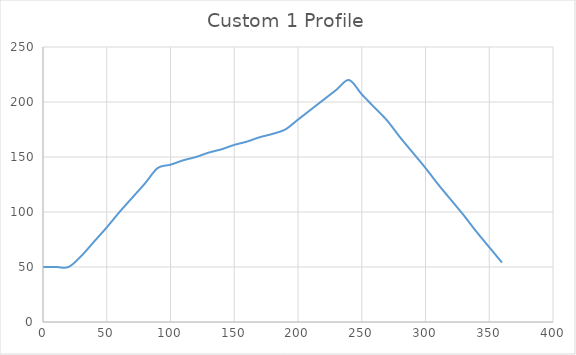
| Category | Custom 1 Profile |
|---|---|
| 0.0 | 50 |
| 10.0 | 50 |
| 20.0 | 50 |
| 30.0 | 60 |
| 40.0 | 73 |
| 50.0 | 86 |
| 60.0 | 100 |
| 70.0 | 113 |
| 80.0 | 126 |
| 90.0 | 140 |
| 100.0 | 143 |
| 110.0 | 147 |
| 120.0 | 150 |
| 130.0 | 154 |
| 140.0 | 157 |
| 150.0 | 161 |
| 160.0 | 164 |
| 170.0 | 168 |
| 180.0 | 171 |
| 190.0 | 175 |
| 200.0 | 184 |
| 210.0 | 193 |
| 220.0 | 202 |
| 230.0 | 211 |
| 240.0 | 220 |
| 250.0 | 207 |
| 260.0 | 195 |
| 270.0 | 183 |
| 280.0 | 168 |
| 290.0 | 154 |
| 300.0 | 140 |
| 310.0 | 125 |
| 320.0 | 111 |
| 330.0 | 97 |
| 340.0 | 82 |
| 350.0 | 68 |
| 360.0 | 54 |